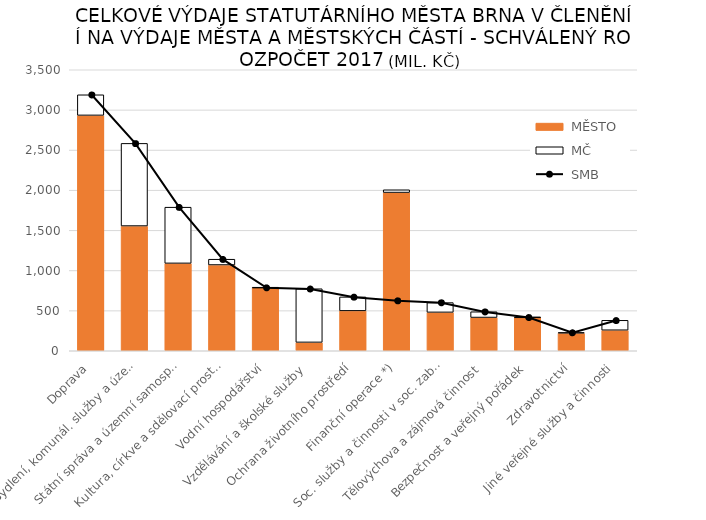
| Category |  MĚSTO |  MČ |
|---|---|---|
|  Doprava | 2931.528 | 256.818 |
|  Bydlení, komunál. služby a územní rozvoj | 1553.406 | 1029.59 |
|  Státní správa a územní samospráva | 1088.439 | 699.992 |
|  Kultura, církve a sdělovací prostředky | 1068.227 | 72.18 |
|  Vodní hospodářství | 785.29 | 1.291 |
|  Vzdělávání a školské služby | 104.151 | 668.18 |
|  Ochrana životního prostředí | 496.878 | 173.872 |
|  Finanční operace *) | 1970.419 | 34.58 |
|  Soc. služby a činnosti v soc. zabezpečení | 478.1 | 122.05 |
|  Tělovýchova a zájmová činnost | 413.916 | 72.128 |
|  Bezpečnost a veřejný pořádek | 416.159 | 0.48 |
|  Zdravotnictví | 219.622 | 7.163 |
|  Jiné veřejné služby a činnosti | 255.742 | 123.65 |